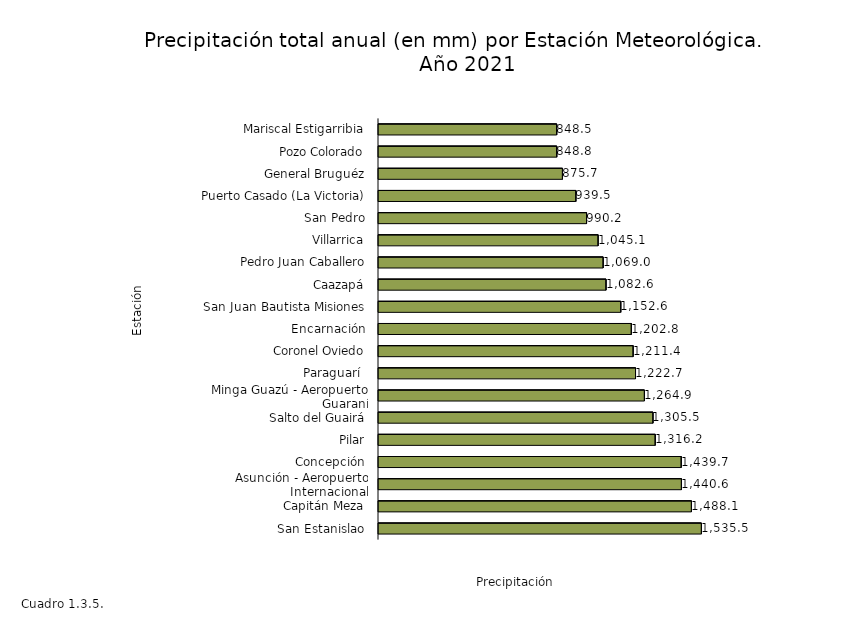
| Category | Series 0 |
|---|---|
| San Estanislao | 1535.5 |
| Capitán Meza | 1488.1 |
| Asunción - Aeropuerto Internacional | 1440.6 |
| Concepción | 1439.7 |
| Pilar | 1316.2 |
| Salto del Guairá | 1305.5 |
| Minga Guazú - Aeropuerto Guaraní | 1264.9 |
| Paraguarí  | 1222.7 |
| Coronel Oviedo | 1211.4 |
| Encarnación | 1202.8 |
| San Juan Bautista Misiones | 1152.6 |
| Caazapá | 1082.6 |
| Pedro Juan Caballero | 1069 |
| Villarrica | 1045.1 |
| San Pedro | 990.2 |
| Puerto Casado (La Victoria) | 939.5 |
| General Bruguéz | 875.7 |
| Pozo Colorado | 848.8 |
| Mariscal Estigarribia | 848.5 |